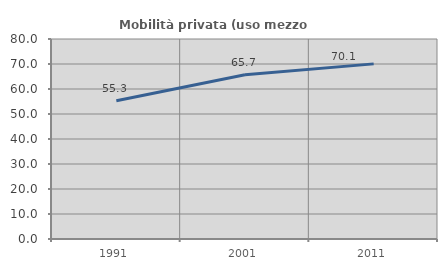
| Category | Mobilità privata (uso mezzo privato) |
|---|---|
| 1991.0 | 55.281 |
| 2001.0 | 65.695 |
| 2011.0 | 70.051 |